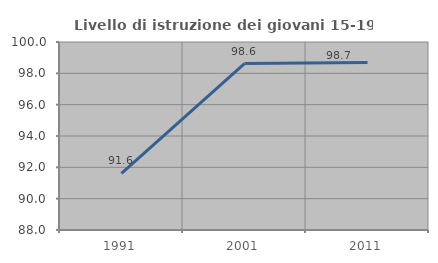
| Category | Livello di istruzione dei giovani 15-19 anni |
|---|---|
| 1991.0 | 91.617 |
| 2001.0 | 98.626 |
| 2011.0 | 98.693 |